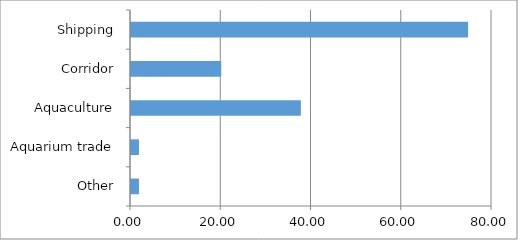
| Category | Series 0 |
|---|---|
| Other | 1.765 |
| Aquarium trade | 1.765 |
| Aquaculture | 37.647 |
| Corridor | 20 |
| Shipping | 74.706 |